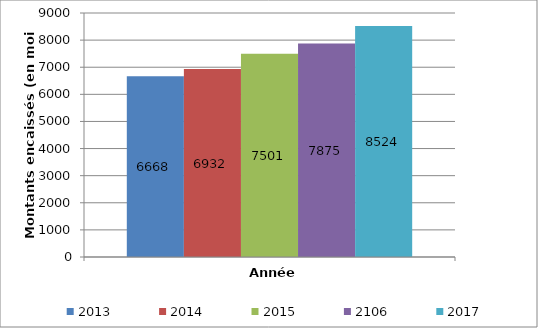
| Category | 2013 | 2014 | 2015 | 2106 | 2017 |
|---|---|---|---|---|---|
| 0 | 6668 | 6932 | 7501 | 7875 | 8524 |